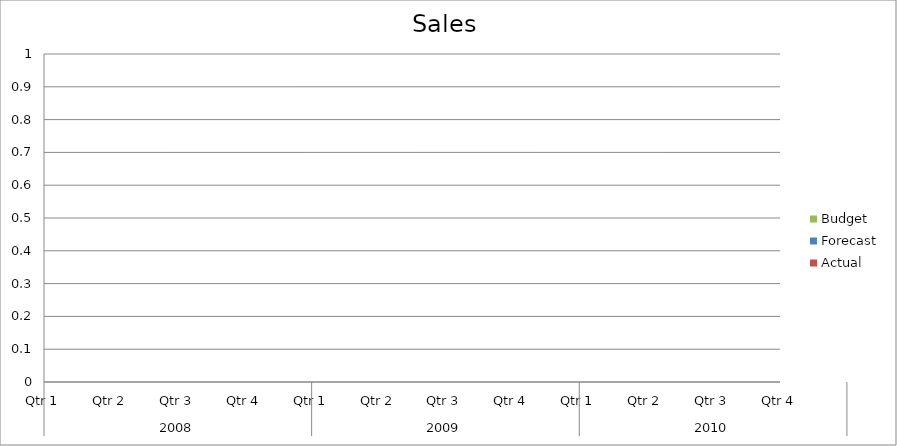
| Category | Budget | Forecast | Actual |
|---|---|---|---|
| 0 | 3470 | 2220 | 2200 |
| 1 | 2160 | 2050 | 2210 |
| 2 | 1500 | 2310 | 2830 |
| 3 | 1070 | 2490 | 2100 |
| 4 | 3300 | 2310 | 1260 |
| 5 | 3000 | 2990 | 1740 |
| 6 | 2260 | 1040 | 3470 |
| 7 | 3200 | 2880 | 2920 |
| 8 | 550 | 1190 | 3480 |
| 9 | 2200 | 1230 | 580 |
| 10 | 630 | 540 | 720 |
| 11 | 650 | 1130 | 2340 |